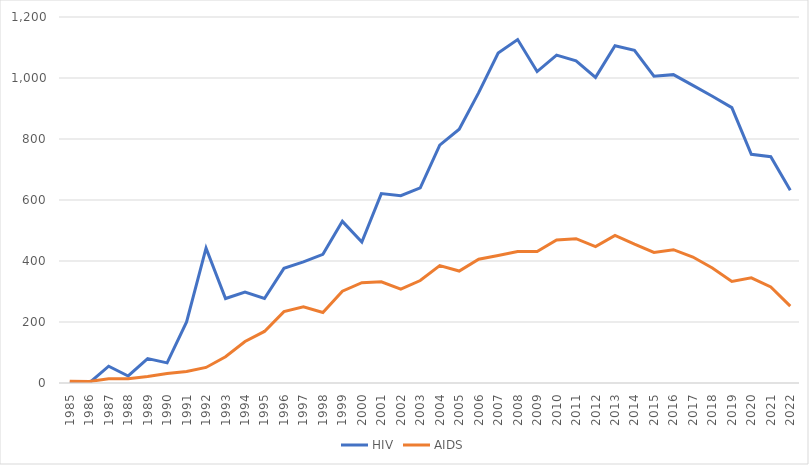
| Category | HIV | AIDS |
|---|---|---|
| 1985.0 | 0 | 6 |
| 1986.0 | 0 | 5 |
| 1987.0 | 55 | 14 |
| 1988.0 | 23 | 14 |
| 1989.0 | 80 | 21 |
| 1990.0 | 66 | 31 |
| 1991.0 | 200 | 38 |
| 1992.0 | 442 | 51 |
| 1993.0 | 277 | 86 |
| 1994.0 | 298 | 136 |
| 1995.0 | 277 | 169 |
| 1996.0 | 376 | 234 |
| 1997.0 | 397 | 250 |
| 1998.0 | 422 | 231 |
| 1999.0 | 530 | 301 |
| 2000.0 | 462 | 329 |
| 2001.0 | 621 | 332 |
| 2002.0 | 614 | 308 |
| 2003.0 | 640 | 336 |
| 2004.0 | 780 | 385 |
| 2005.0 | 832 | 367 |
| 2006.0 | 952 | 406 |
| 2007.0 | 1082 | 418 |
| 2008.0 | 1126 | 431 |
| 2009.0 | 1021 | 431 |
| 2010.0 | 1075 | 469 |
| 2011.0 | 1056 | 473 |
| 2012.0 | 1002 | 447 |
| 2013.0 | 1106 | 484 |
| 2014.0 | 1091 | 455 |
| 2015.0 | 1006 | 428 |
| 2016.0 | 1011 | 437 |
| 2017.0 | 976 | 413 |
| 2018.0 | 940 | 377 |
| 2019.0 | 903 | 333 |
| 2020.0 | 750 | 345 |
| 2021.0 | 742 | 315 |
| 2022.0 | 632 | 252 |